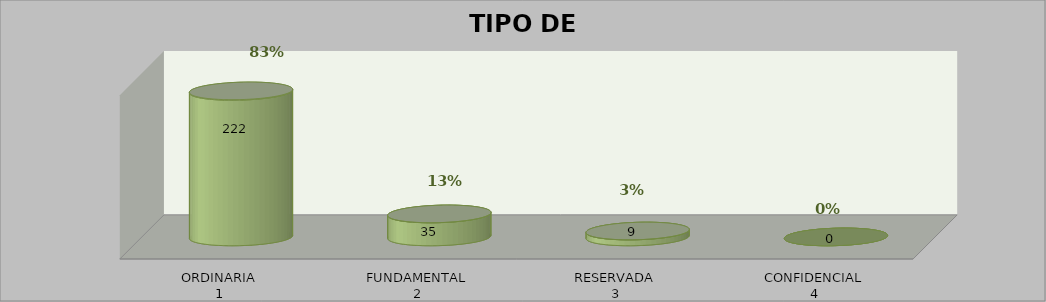
| Category | Series 0 | Series 2 | Series 3 | Series 1 |
|---|---|---|---|---|
| 0 |  | 222 | 0.835 |  |
| 1 |  | 35 | 0.132 |  |
| 2 |  | 9 | 0.034 |  |
| 3 |  | 0 | 0 |  |